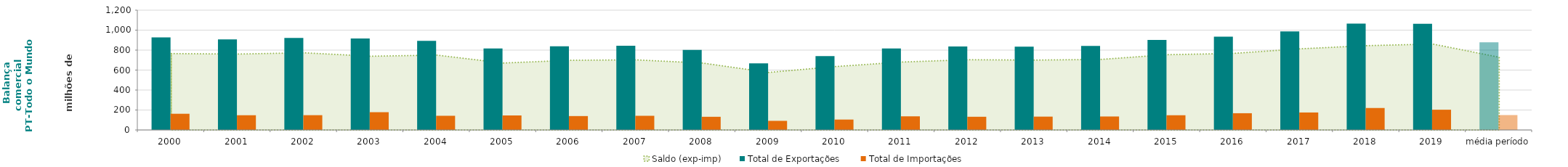
| Category | Total de Exportações  | Total de Importações  |
|---|---|---|
| 2000 | 927.507 | 162.341 |
| 2001 | 908.085 | 147.587 |
| 2002 | 921.18 | 148.139 |
| 2003 | 916.814 | 178.058 |
| 2004 | 891.902 | 142.096 |
| 2005 | 815.757 | 145.443 |
| 2006 | 837.33 | 139.346 |
| 2007 | 844.064 | 141.949 |
| 2008 | 802.517 | 132.066 |
| 2009 | 667.69 | 91.371 |
| 2010 | 739.381 | 104.282 |
| 2011 | 817.035 | 136.688 |
| 2012 | 835.816 | 132.304 |
| 2013 | 833.695 | 133.688 |
| 2014 | 841.785 | 135.004 |
| 2015 | 901.525 | 147.483 |
| 2016 | 934.836 | 167.809 |
| 2017 | 988.036 | 175.229 |
| 2018 | 1064.655 | 220.102 |
| 2019 | 1063.721 | 202.823 |
| média período | 877.667 | 149.19 |